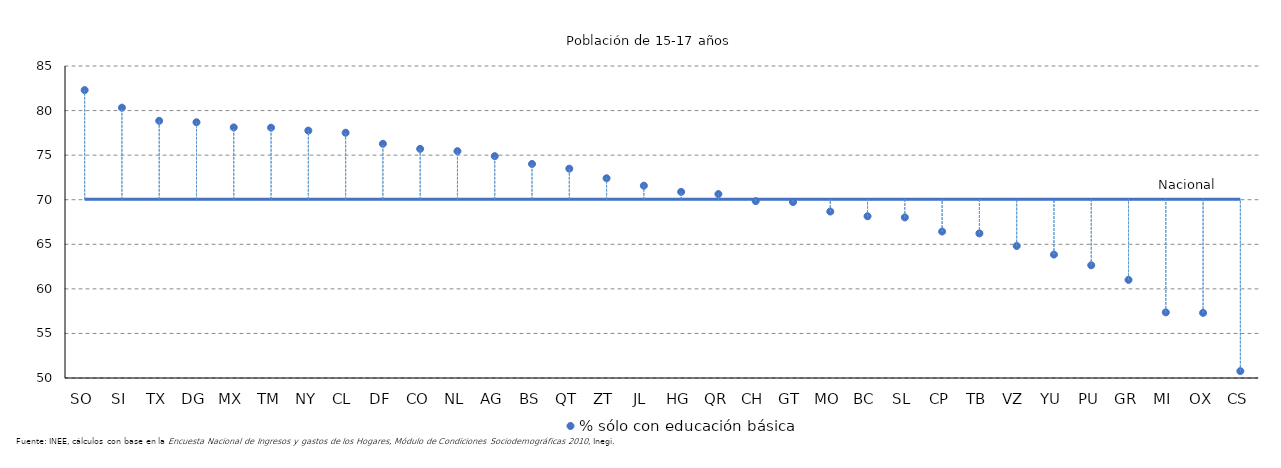
| Category | % sólo con educación básica | Series 0 |
|---|---|---|
| SO | 82.294 | 70.056 |
| SI | 80.328 | 70.056 |
| TX | 78.849 | 70.056 |
| DG | 78.691 | 70.056 |
| MX | 78.112 | 70.056 |
| TM | 78.087 | 70.056 |
| NY | 77.756 | 70.056 |
| CL | 77.513 | 70.056 |
| DF | 76.276 | 70.056 |
| CO | 75.705 | 70.056 |
| NL | 75.447 | 70.056 |
| AG | 74.885 | 70.056 |
| BS | 74.014 | 70.056 |
| QT | 73.484 | 70.056 |
| ZT | 72.408 | 70.056 |
| JL | 71.576 | 70.056 |
| HG | 70.881 | 70.056 |
| QR | 70.633 | 70.056 |
| CH | 69.842 | 70.056 |
| GT | 69.737 | 70.056 |
| MO | 68.674 | 70.056 |
| BC | 68.147 | 70.056 |
| SL | 68.013 | 70.056 |
| CP | 66.431 | 70.056 |
| TB | 66.22 | 70.056 |
| VZ | 64.811 | 70.056 |
| YU | 63.846 | 70.056 |
| PU | 62.646 | 70.056 |
| GR | 61.006 | 70.056 |
| MI | 57.361 | 70.056 |
| OX | 57.306 | 70.056 |
| CS | 50.774 | 70.056 |